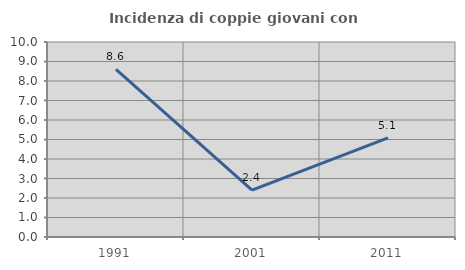
| Category | Incidenza di coppie giovani con figli |
|---|---|
| 1991.0 | 8.602 |
| 2001.0 | 2.4 |
| 2011.0 | 5.085 |